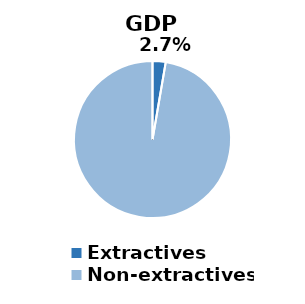
| Category | GDP (%) |
|---|---|
| Extractives | 0.027 |
| Non-extractives | 0.973 |